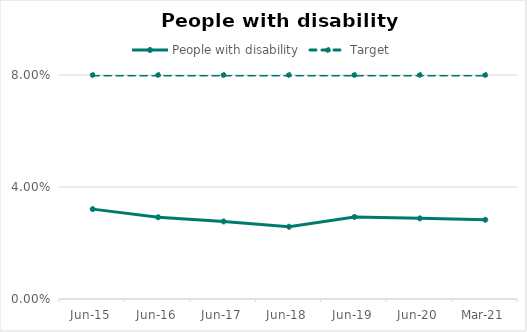
| Category | People with disability | Target |
|---|---|---|
| 2015-06-01 | 0.032 | 0.08 |
| 2016-06-01 | 0.029 | 0.08 |
| 2017-06-01 | 0.028 | 0.08 |
| 2018-06-01 | 0.026 | 0.08 |
| 2019-06-01 | 0.029 | 0.08 |
| 2020-06-01 | 0.029 | 0.08 |
| 2021-03-01 | 0.028 | 0.08 |